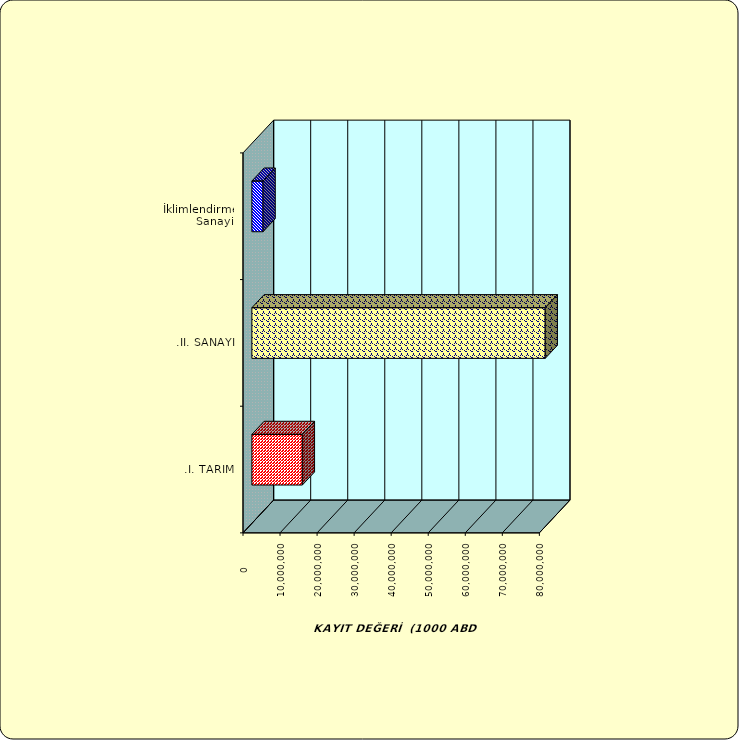
| Category | Series 0 |
|---|---|
| .I. TARIM | 13616542.017 |
| .II. SANAYİ | 79183952.665 |
|  İklimlendirme Sanayii | 3014643.596 |